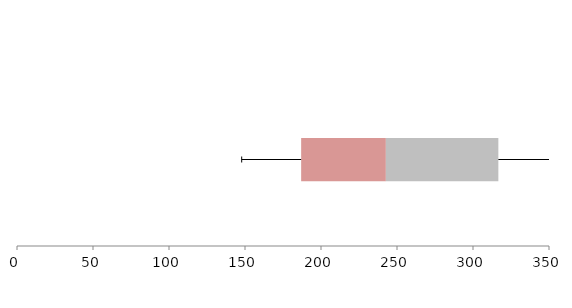
| Category | Series 1 | Series 2 | Series 3 |
|---|---|---|---|
| 0 | 186.944 | 55.73 | 74.012 |